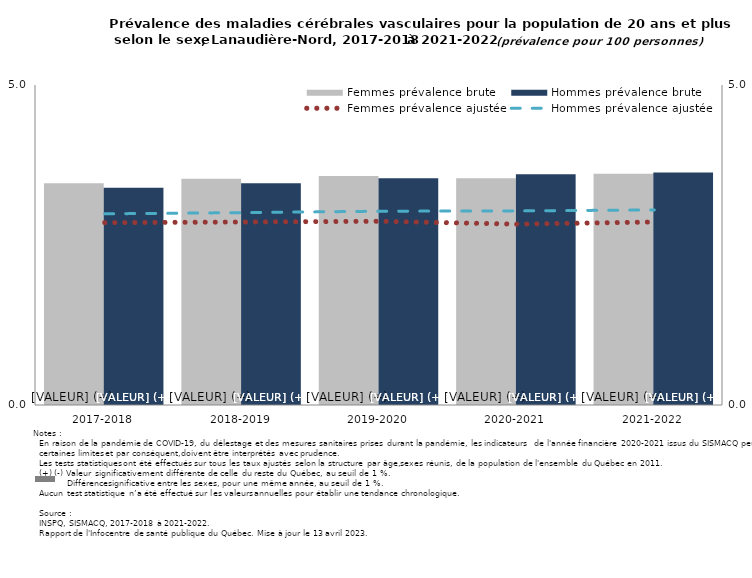
| Category | Femmes prévalence brute | Hommes prévalence brute |
|---|---|---|
| 2017-2018 | 3.466 | 3.396 |
| 2018-2019 | 3.534 | 3.466 |
| 2019-2020 | 3.576 | 3.543 |
| 2020-2021 | 3.541 | 3.605 |
| 2021-2022 | 3.615 | 3.632 |